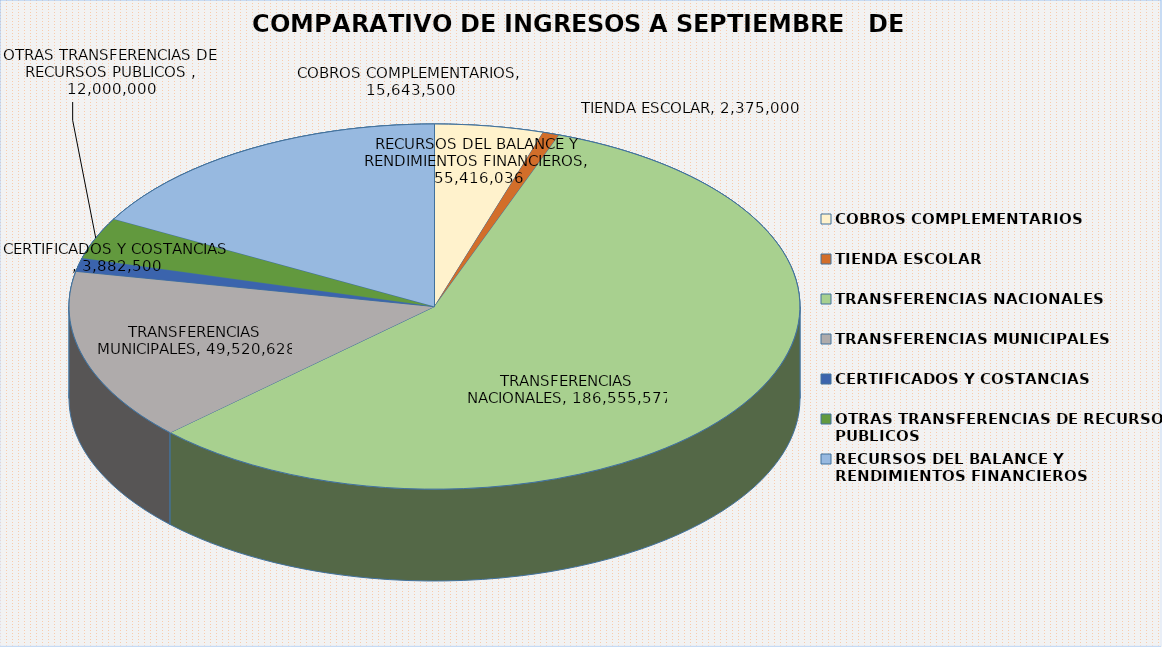
| Category | Series 0 | Series 1 |
|---|---|---|
| COBROS COMPLEMENTARIOS | 15643500 | 0.048 |
| TIENDA ESCOLAR | 2375000 | 0.007 |
| TRANSFERENCIAS NACIONALES | 186555577 | 0.573 |
| TRANSFERENCIAS MUNICIPALES | 49520628 | 0.152 |
| CERTIFICADOS Y COSTANCIAS  | 3882500 | 0.012 |
| OTRAS TRANSFERENCIAS DE RECURSOS PUBLICOS  | 12000000 | 0.037 |
| RECURSOS DEL BALANCE Y RENDIMIENTOS FINANCIEROS | 55416036 | 0.17 |